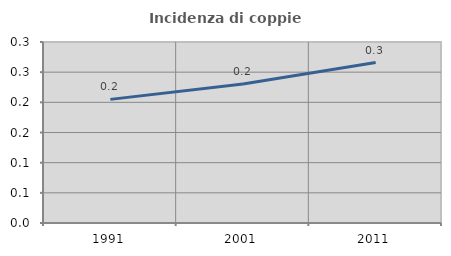
| Category | Incidenza di coppie miste |
|---|---|
| 1991.0 | 0.205 |
| 2001.0 | 0.23 |
| 2011.0 | 0.266 |